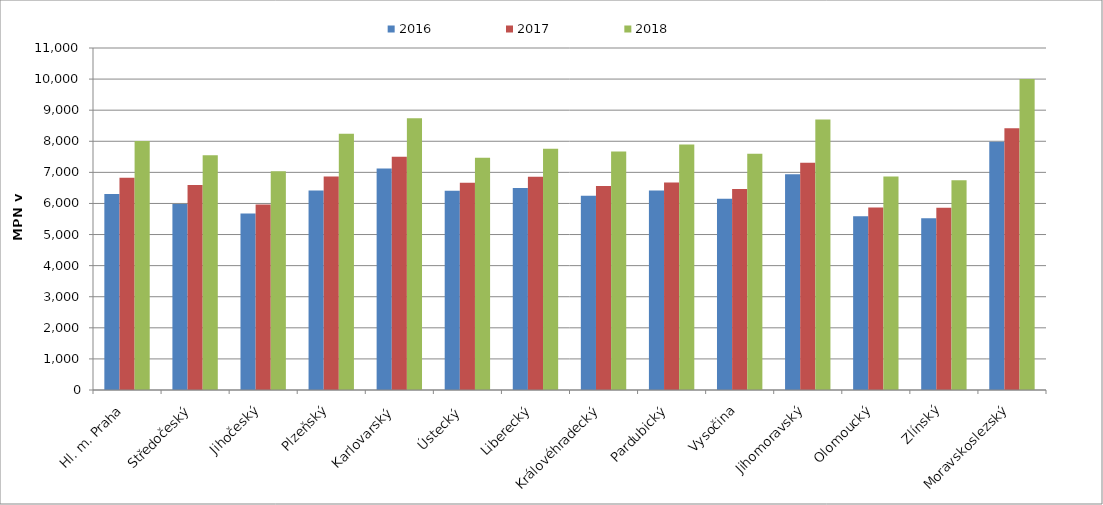
| Category | 2016 | 2017 | 2018 |
|---|---|---|---|
| Hl. m. Praha | 6305.3 | 6826.855 | 8009.894 |
| Středočeský | 5982.251 | 6593.902 | 7547.562 |
| Jihočeský | 5680.637 | 5964.423 | 7032.125 |
| Plzeňský | 6417.35 | 6866.693 | 8240.032 |
| Karlovarský  | 7123.583 | 7501.349 | 8742.58 |
| Ústecký   | 6411.886 | 6668.343 | 7468.343 |
| Liberecký | 6500.574 | 6857.487 | 7756.907 |
| Královéhradecký | 6245.588 | 6557.867 | 7672.7 |
| Pardubický | 6414.095 | 6670.856 | 7894.512 |
| Vysočina | 6149.458 | 6461.897 | 7599.269 |
| Jihomoravský | 6942.687 | 7312.723 | 8696.314 |
| Olomoucký | 5589.579 | 5869.148 | 6866.84 |
| Zlínský | 5521.524 | 5862.51 | 6749.747 |
| Moravskoslezský | 7982.963 | 8422.554 | 9999.219 |